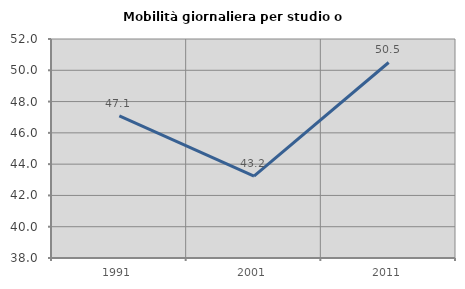
| Category | Mobilità giornaliera per studio o lavoro |
|---|---|
| 1991.0 | 47.084 |
| 2001.0 | 43.227 |
| 2011.0 | 50.499 |